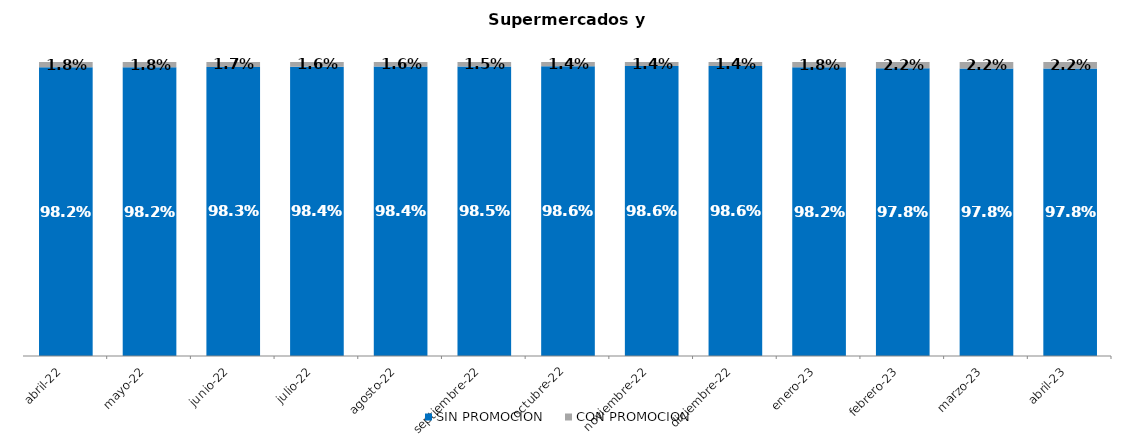
| Category | SIN PROMOCION   | CON PROMOCION   |
|---|---|---|
| 2022-04-01 | 0.982 | 0.018 |
| 2022-05-01 | 0.982 | 0.018 |
| 2022-06-01 | 0.983 | 0.017 |
| 2022-07-01 | 0.984 | 0.016 |
| 2022-08-01 | 0.984 | 0.016 |
| 2022-09-01 | 0.985 | 0.015 |
| 2022-10-01 | 0.986 | 0.014 |
| 2022-11-01 | 0.986 | 0.014 |
| 2022-12-01 | 0.986 | 0.014 |
| 2023-01-01 | 0.982 | 0.018 |
| 2023-02-01 | 0.978 | 0.022 |
| 2023-03-01 | 0.978 | 0.022 |
| 2023-04-01 | 0.978 | 0.022 |